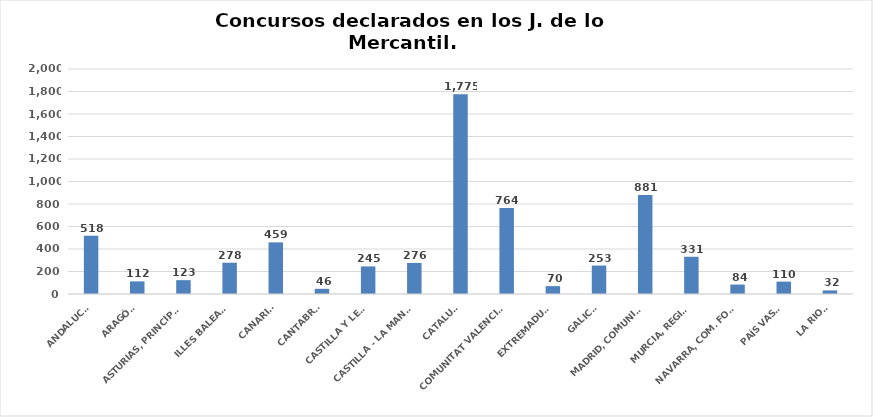
| Category | Series 0 |
|---|---|
| ANDALUCÍA | 518 |
| ARAGÓN | 112 |
| ASTURIAS, PRINCIPADO | 123 |
| ILLES BALEARS | 278 |
| CANARIAS | 459 |
| CANTABRIA | 46 |
| CASTILLA Y LEÓN | 245 |
| CASTILLA - LA MANCHA | 276 |
| CATALUÑA | 1775 |
| COMUNITAT VALENCIANA | 764 |
| EXTREMADURA | 70 |
| GALICIA | 253 |
| MADRID, COMUNIDAD | 881 |
| MURCIA, REGIÓN | 331 |
| NAVARRA, COM. FORAL | 84 |
| PAÍS VASCO | 110 |
| LA RIOJA | 32 |